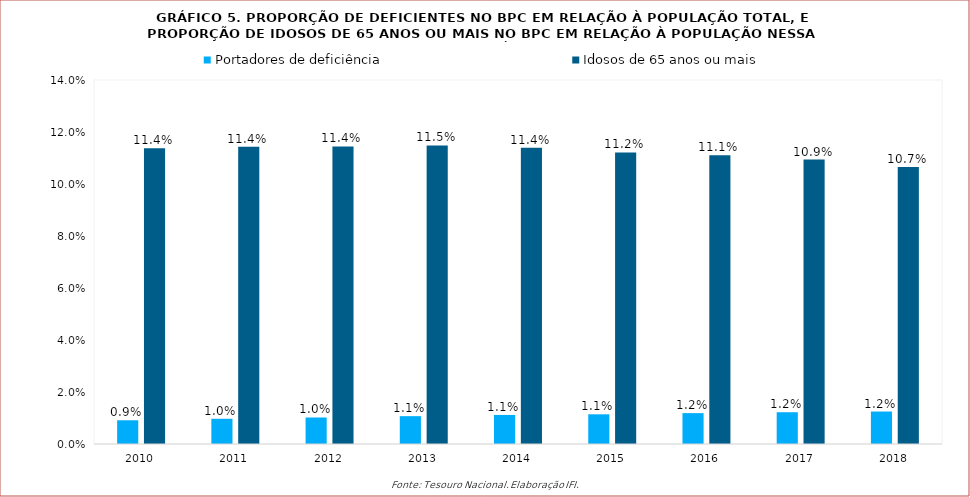
| Category | Portadores de deficiência | Idosos de 65 anos ou mais |
|---|---|---|
| 2010.0 | 0.009 | 0.114 |
| 2011.0 | 0.01 | 0.114 |
| 2012.0 | 0.01 | 0.114 |
| 2013.0 | 0.011 | 0.115 |
| 2014.0 | 0.011 | 0.114 |
| 2015.0 | 0.011 | 0.112 |
| 2016.0 | 0.012 | 0.111 |
| 2017.0 | 0.012 | 0.109 |
| 2018.0 | 0.012 | 0.107 |